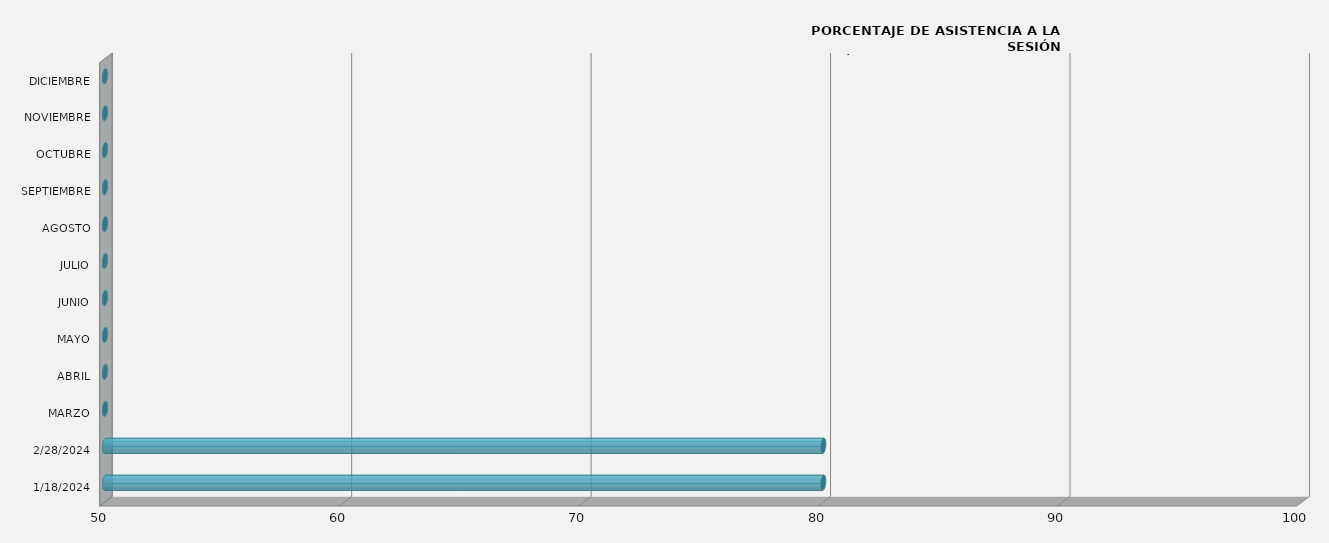
| Category | Series 0 |
|---|---|
| 18/01/2024 | 80 |
| 28/02/2024 | 80 |
| MARZO | 0 |
| ABRIL | 0 |
| MAYO | 0 |
| JUNIO | 0 |
| JULIO | 0 |
| AGOSTO | 0 |
| SEPTIEMBRE | 0 |
| OCTUBRE | 0 |
| NOVIEMBRE | 0 |
| DICIEMBRE | 0 |